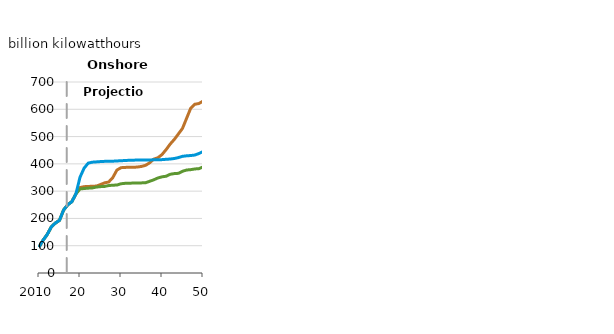
| Category | No PTC/ITC Sunset case | BkWh | Reference case |
|---|---|---|---|
| 2010.0 | 94.806 | 94.806 | 94.806 |
| 2011.0 | 120.343 | 120.343 | 120.343 |
| 2012.0 | 141.055 | 141.055 | 141.055 |
| 2013.0 | 168.835 | 168.835 | 168.835 |
| 2014.0 | 183.189 | 183.189 | 183.189 |
| 2015.0 | 193.228 | 193.228 | 193.228 |
| 2016.0 | 230.848 | 230.848 | 230.848 |
| 2017.0 | 249.861 | 249.861 | 249.861 |
| 2018.0 | 261.242 | 261.242 | 261.242 |
| 2019.0 | 289.653 | 289.665 | 289.651 |
| 20.0 | 313.161 | 307.959 | 350.927 |
| 2021.0 | 316.433 | 309.648 | 384.202 |
| 2022.0 | 317.1 | 310.918 | 402.611 |
| 2023.0 | 318.011 | 311.838 | 406.162 |
| 2024.0 | 318.569 | 315.055 | 407.227 |
| 2025.0 | 324.249 | 316.495 | 408.388 |
| 2026.0 | 330.38 | 317.337 | 409.169 |
| 2027.0 | 333.505 | 320.474 | 409.791 |
| 2028.0 | 349.685 | 321.779 | 409.788 |
| 2029.0 | 377.24 | 322.36 | 410.572 |
| 30.0 | 385.99 | 327.064 | 411.522 |
| 2031.0 | 387.068 | 328.657 | 412.198 |
| 2032.0 | 387.214 | 329.173 | 413.174 |
| 2033.0 | 387.345 | 329.542 | 413.578 |
| 2034.0 | 388.407 | 329.95 | 413.863 |
| 2035.0 | 390.566 | 330.257 | 414.056 |
| 2036.0 | 394.667 | 330.847 | 414.055 |
| 2037.0 | 404.014 | 336.226 | 414.325 |
| 2038.0 | 417.506 | 341.557 | 414.821 |
| 2039.0 | 422.497 | 348.311 | 415.421 |
| 40.0 | 434.055 | 352.391 | 415.509 |
| 2041.0 | 452.143 | 354.64 | 416.694 |
| 2042.0 | 472.55 | 361.795 | 417.741 |
| 2043.0 | 489.559 | 364.33 | 419.578 |
| 2044.0 | 509.646 | 365.287 | 422.981 |
| 2045.0 | 530.068 | 372.665 | 427.652 |
| 2046.0 | 566.92 | 377.517 | 429.448 |
| 2047.0 | 603.824 | 378.671 | 430.515 |
| 2048.0 | 618.412 | 381.335 | 432.316 |
| 2049.0 | 621.058 | 382.405 | 437.81 |
| 50.0 | 629.938 | 388.64 | 445.193 |